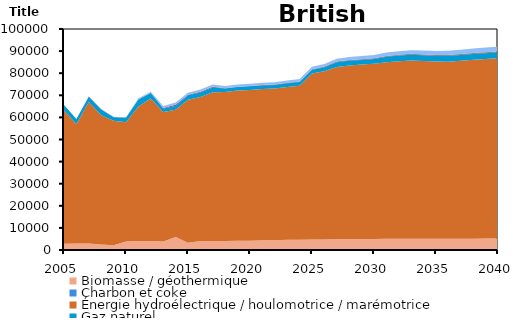
| Category | Biomasse / géothermique | Charbon et coke | Énergie hydroélectrique / houlomotrice / marémotrice | Gaz naturel | Pétrole | Solaire | Uranium | Éolien |
|---|---|---|---|---|---|---|---|---|
| 2005.0 | 2863.407 | 0 | 60327 | 2382.917 | 91.056 | 0 | 0 | 0 |
| 2006.0 | 2948.704 | 0 | 53902.91 | 2388.621 | 35.556 | 0 | 0 | 0 |
| 2007.0 | 2948.704 | 0 | 64015.8 | 2388.62 | 91.556 | 0 | 0 | 0 |
| 2008.0 | 2467.383 | 0 | 58525.63 | 2635.125 | 94.568 | 0 | 0 | 0 |
| 2009.0 | 2162.837 | 0 | 56298.4 | 1635.694 | 111.112 | 0 | 0 | 34 |
| 2010.0 | 3810.735 | 0 | 53970.88 | 2089.002 | 107.104 | 0 | 0 | 123 |
| 2011.0 | 4110.999 | 0 | 60772.07 | 3214.862 | 91.712 | 0 | 0 | 484.602 |
| 2012.0 | 4034.091 | 0 | 64477.04 | 2557.922 | 46.184 | 0 | 0 | 507.981 |
| 2013.0 | 3821.901 | 0 | 58666.27 | 1520.026 | 289.309 | 0 | 0 | 860 |
| 2014.0 | 5856.074 | 0 | 57572.87 | 1689.203 | 556.96 | 0 | 0 | 1071.139 |
| 2015.0 | 3275.062 | 0 | 64713.33 | 2050.774 | 196.85 | 0 | 0 | 867.895 |
| 2016.0 | 4030.003 | 0 | 65194.44 | 2077.94 | 304.474 | 0 | 0 | 1058.948 |
| 2017.0 | 4040.525 | 0 | 67340.4 | 2115.704 | 330.782 | 0 | 0 | 1015.417 |
| 2018.0 | 4040.524 | 0 | 67459.69 | 1528.177 | 160.6 | 7.008 | 0 | 1015.417 |
| 2019.0 | 4218.789 | 0 | 68009.38 | 1516.383 | 160.6 | 7.008 | 0 | 1015.417 |
| 2020.0 | 4218.789 | 0 | 68221.81 | 1634.319 | 160.6 | 7.008 | 0 | 1015.417 |
| 2021.0 | 4397.053 | 0 | 68434.27 | 1634.32 | 160.6 | 20.148 | 0 | 1015.417 |
| 2022.0 | 4397.053 | 0 | 68646.69 | 1636.05 | 160.6 | 33.288 | 0 | 1050.457 |
| 2023.0 | 4590.691 | 0 | 69206.12 | 1647.177 | 160.6 | 53.436 | 0 | 1085.497 |
| 2024.0 | 4607.169 | 0 | 69744.25 | 1655.513 | 160.6 | 66.576 | 0 | 1120.537 |
| 2025.0 | 4753.581 | 0 | 75147.2 | 1660.6 | 160.6 | 79.716 | 0 | 1155.577 |
| 2026.0 | 4784.433 | 0 | 76111.87 | 1849.27 | 160.6 | 92.856 | 0 | 1190.617 |
| 2027.0 | 4985.819 | 0 | 77794.23 | 2223.952 | 172.689 | 105.996 | 0 | 1269.458 |
| 2028.0 | 5005.484 | 0 | 78489.21 | 2242.826 | 164.105 | 126.144 | 0 | 1348.298 |
| 2029.0 | 5008.357 | 0 | 78892.54 | 2125.525 | 160.6 | 139.284 | 0 | 1427.136 |
| 2030.0 | 5019.908 | 0 | 79305.02 | 2139.751 | 170.722 | 152.424 | 0 | 1462.177 |
| 2031.0 | 5062.909 | 0 | 79842.62 | 2538.719 | 170.688 | 165.564 | 0 | 1541.018 |
| 2032.0 | 5092.802 | 0 | 80329.57 | 2575.352 | 160.6 | 178.704 | 0 | 1576.057 |
| 2033.0 | 5120.564 | 0 | 80657.79 | 2608.667 | 178.75 | 198.852 | 0 | 1654.898 |
| 2034.0 | 5101.451 | 0 | 80431.36 | 2561.362 | 175.727 | 211.992 | 0 | 1733.737 |
| 2035.0 | 5110.105 | 0 | 80159.71 | 2556.11 | 172.689 | 225.132 | 0 | 1812.576 |
| 2036.0 | 5119.872 | 0 | 80115.37 | 2621.646 | 168.619 | 238.272 | 0 | 1891.416 |
| 2037.0 | 5130.087 | 0 | 80518.27 | 2619.398 | 160.6 | 251.412 | 0 | 1970.258 |
| 2038.0 | 5141.836 | 0 | 80952.3 | 2616.25 | 160.6 | 271.56 | 0 | 2049.097 |
| 2039.0 | 5155.065 | 0 | 81295.27 | 2617.833 | 160.6 | 284.7 | 0 | 2127.938 |
| 2040.0 | 5169.254 | 0 | 81580.35 | 2620.94 | 162.633 | 297.84 | 0 | 2206.776 |